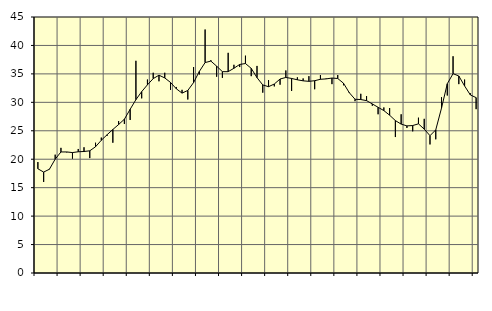
| Category | Piggar | Series 1 |
|---|---|---|
| nan | 19.5 | 18.32 |
| 1.0 | 16 | 17.74 |
| 1.0 | 18.3 | 18.24 |
| 1.0 | 20.8 | 20.01 |
| nan | 22 | 21.28 |
| 2.0 | 21.2 | 21.28 |
| 2.0 | 20.1 | 21.17 |
| 2.0 | 21.8 | 21.31 |
| nan | 22.1 | 21.36 |
| 3.0 | 20.2 | 21.48 |
| 3.0 | 22.9 | 22.19 |
| 3.0 | 23.8 | 23.33 |
| nan | 24.1 | 24.3 |
| 4.0 | 22.9 | 25.23 |
| 4.0 | 26.7 | 26.1 |
| 4.0 | 26.2 | 27.03 |
| nan | 26.9 | 28.78 |
| 5.0 | 37.3 | 30.47 |
| 5.0 | 30.7 | 31.88 |
| 5.0 | 34 | 33.08 |
| nan | 35.2 | 34.17 |
| 6.0 | 33.7 | 34.77 |
| 6.0 | 35.2 | 34.29 |
| 6.0 | 32.2 | 33.5 |
| nan | 32.7 | 32.39 |
| 7.0 | 32.2 | 31.62 |
| 7.0 | 30.5 | 32.09 |
| 7.0 | 36.2 | 33.47 |
| nan | 34.9 | 35.43 |
| 8.0 | 42.8 | 36.99 |
| 8.0 | 37.4 | 37.25 |
| 8.0 | 34.5 | 36.36 |
| nan | 34.3 | 35.39 |
| 9.0 | 38.7 | 35.39 |
| 9.0 | 36.6 | 35.99 |
| 9.0 | 36.2 | 36.66 |
| nan | 38.2 | 36.82 |
| 10.0 | 34.6 | 35.97 |
| 10.0 | 36.4 | 34.34 |
| 10.0 | 31.7 | 33.06 |
| nan | 33.9 | 32.75 |
| 11.0 | 32.8 | 33.22 |
| 11.0 | 33.1 | 34.1 |
| 11.0 | 35.6 | 34.37 |
| nan | 32 | 34.2 |
| 12.0 | 34.4 | 33.96 |
| 12.0 | 34.2 | 33.78 |
| 12.0 | 34.6 | 33.69 |
| nan | 32.3 | 33.8 |
| 13.0 | 34.8 | 34.05 |
| 13.0 | 34.2 | 34.12 |
| 13.0 | 33.2 | 34.27 |
| nan | 34.8 | 34.19 |
| 14.0 | 33 | 33.36 |
| 14.0 | 31.8 | 31.7 |
| 14.0 | 30.2 | 30.54 |
| nan | 31.5 | 30.49 |
| 15.0 | 31.1 | 30.3 |
| 15.0 | 29.4 | 29.72 |
| 15.0 | 27.9 | 29.13 |
| nan | 29.1 | 28.55 |
| 16.0 | 29 | 27.74 |
| 16.0 | 23.9 | 26.79 |
| 16.0 | 27.9 | 26.17 |
| nan | 25.5 | 25.86 |
| 17.0 | 24.9 | 25.92 |
| 17.0 | 27.3 | 26.22 |
| 17.0 | 27.1 | 25.29 |
| nan | 22.6 | 24.14 |
| 18.0 | 23.5 | 25.16 |
| 18.0 | 30.9 | 29 |
| 18.0 | 31.2 | 33.27 |
| nan | 38.1 | 35.04 |
| 19.0 | 33.2 | 34.63 |
| 19.0 | 34 | 32.88 |
| 19.0 | 31.6 | 31.3 |
| nan | 28.8 | 30.83 |